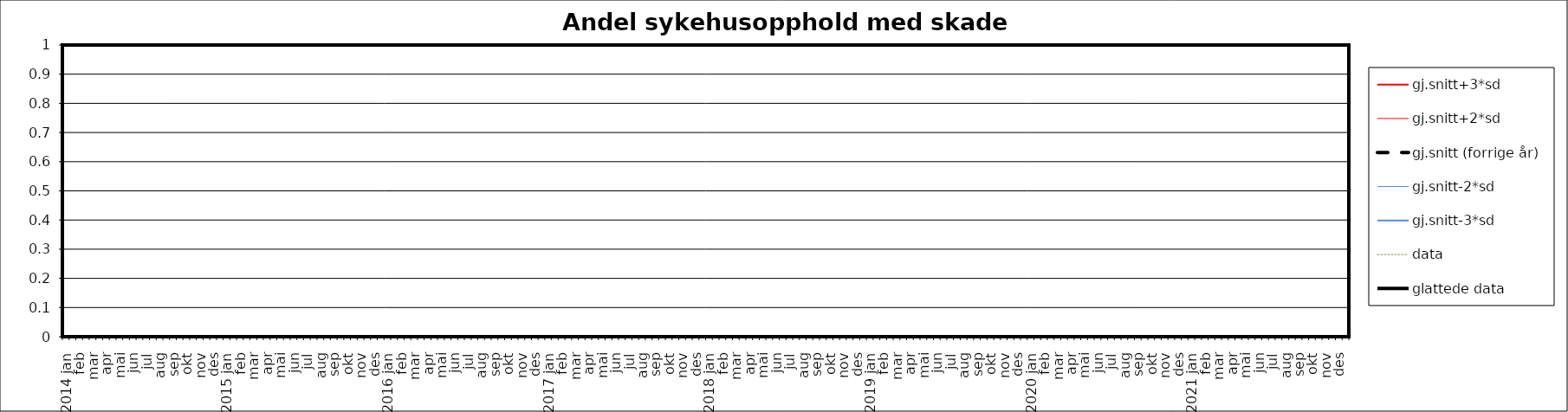
| Category | gj.snitt+3*sd | gj.snitt+2*sd | gj.snitt (forrige år) | gj.snitt-2*sd | gj.snitt-3*sd | data | glattede data |
|---|---|---|---|---|---|---|---|
| 2014 jan | 0 | 0 | 0 | 0 | 0 | 0 | 0 |
|  | 0 | 0 | 0 | 0 | 0 | 0 | 0 |
| feb | 0 | 0 | 0 | 0 | 0 | 0 | 0 |
|  | 0 | 0 | 0 | 0 | 0 | 0 | 0 |
| mar | 0 | 0 | 0 | 0 | 0 | 0 | 0 |
|  | 0 | 0 | 0 | 0 | 0 | 0 | 0 |
| apr | 0 | 0 | 0 | 0 | 0 | 0 | 0 |
|  | 0 | 0 | 0 | 0 | 0 | 0 | 0 |
| mai | 0 | 0 | 0 | 0 | 0 | 0 | 0 |
|  | 0 | 0 | 0 | 0 | 0 | 0 | 0 |
| jun | 0 | 0 | 0 | 0 | 0 | 0 | 0 |
|  | 0 | 0 | 0 | 0 | 0 | 0 | 0 |
| jul | 0 | 0 | 0 | 0 | 0 | 0 | 0 |
|  | 0 | 0 | 0 | 0 | 0 | 0 | 0 |
| aug | 0 | 0 | 0 | 0 | 0 | 0 | 0 |
|  | 0 | 0 | 0 | 0 | 0 | 0 | 0 |
| sep | 0 | 0 | 0 | 0 | 0 | 0 | 0 |
|  | 0 | 0 | 0 | 0 | 0 | 0 | 0 |
| okt | 0 | 0 | 0 | 0 | 0 | 0 | 0 |
|  | 0 | 0 | 0 | 0 | 0 | 0 | 0 |
| nov | 0 | 0 | 0 | 0 | 0 | 0 | 0 |
|  | 0 | 0 | 0 | 0 | 0 | 0 | 0 |
| des | 0 | 0 | 0 | 0 | 0 | 0 | 0 |
|  | 0 | 0 | 0 | 0 | 0 | 0 | 0 |
| 2015 jan | 0 | 0 | 0 | 0 | 0 | 0 | 0 |
|  | 0 | 0 | 0 | 0 | 0 | 0 | 0 |
| feb | 0 | 0 | 0 | 0 | 0 | 0 | 0 |
|  | 0 | 0 | 0 | 0 | 0 | 0 | 0 |
| mar | 0 | 0 | 0 | 0 | 0 | 0 | 0 |
|  | 0 | 0 | 0 | 0 | 0 | 0 | 0 |
| apr | 0 | 0 | 0 | 0 | 0 | 0 | 0 |
|  | 0 | 0 | 0 | 0 | 0 | 0 | 0 |
| mai | 0 | 0 | 0 | 0 | 0 | 0 | 0 |
|  | 0 | 0 | 0 | 0 | 0 | 0 | 0 |
| jun | 0 | 0 | 0 | 0 | 0 | 0 | 0 |
|  | 0 | 0 | 0 | 0 | 0 | 0 | 0 |
| jul | 0 | 0 | 0 | 0 | 0 | 0 | 0 |
|  | 0 | 0 | 0 | 0 | 0 | 0 | 0 |
| aug | 0 | 0 | 0 | 0 | 0 | 0 | 0 |
|  | 0 | 0 | 0 | 0 | 0 | 0 | 0 |
| sep | 0 | 0 | 0 | 0 | 0 | 0 | 0 |
|  | 0 | 0 | 0 | 0 | 0 | 0 | 0 |
| okt | 0 | 0 | 0 | 0 | 0 | 0 | 0 |
|  | 0 | 0 | 0 | 0 | 0 | 0 | 0 |
| nov | 0 | 0 | 0 | 0 | 0 | 0 | 0 |
|  | 0 | 0 | 0 | 0 | 0 | 0 | 0 |
| des | 0 | 0 | 0 | 0 | 0 | 0 | 0 |
|  | 0 | 0 | 0 | 0 | 0 | 0 | 0 |
| 2016 jan | 0 | 0 | 0 | 0 | 0 | 0 | 0 |
|  | 0 | 0 | 0 | 0 | 0 | 0 | 0 |
| feb | 0 | 0 | 0 | 0 | 0 | 0 | 0 |
|  | 0 | 0 | 0 | 0 | 0 | 0 | 0 |
| mar | 0 | 0 | 0 | 0 | 0 | 0 | 0 |
|  | 0 | 0 | 0 | 0 | 0 | 0 | 0 |
| apr | 0 | 0 | 0 | 0 | 0 | 0 | 0 |
|  | 0 | 0 | 0 | 0 | 0 | 0 | 0 |
| mai | 0 | 0 | 0 | 0 | 0 | 0 | 0 |
|  | 0 | 0 | 0 | 0 | 0 | 0 | 0 |
| jun | 0 | 0 | 0 | 0 | 0 | 0 | 0 |
|  | 0 | 0 | 0 | 0 | 0 | 0 | 0 |
| jul | 0 | 0 | 0 | 0 | 0 | 0 | 0 |
|  | 0 | 0 | 0 | 0 | 0 | 0 | 0 |
| aug | 0 | 0 | 0 | 0 | 0 | 0 | 0 |
|  | 0 | 0 | 0 | 0 | 0 | 0 | 0 |
| sep | 0 | 0 | 0 | 0 | 0 | 0 | 0 |
|  | 0 | 0 | 0 | 0 | 0 | 0 | 0 |
| okt | 0 | 0 | 0 | 0 | 0 | 0 | 0 |
|  | 0 | 0 | 0 | 0 | 0 | 0 | 0 |
| nov | 0 | 0 | 0 | 0 | 0 | 0 | 0 |
|  | 0 | 0 | 0 | 0 | 0 | 0 | 0 |
| des | 0 | 0 | 0 | 0 | 0 | 0 | 0 |
|  | 0 | 0 | 0 | 0 | 0 | 0 | 0 |
| 2017 jan | 0 | 0 | 0 | 0 | 0 | 0 | 0 |
|  | 0 | 0 | 0 | 0 | 0 | 0 | 0 |
| feb | 0 | 0 | 0 | 0 | 0 | 0 | 0 |
|  | 0 | 0 | 0 | 0 | 0 | 0 | 0 |
| mar | 0 | 0 | 0 | 0 | 0 | 0 | 0 |
|  | 0 | 0 | 0 | 0 | 0 | 0 | 0 |
| apr | 0 | 0 | 0 | 0 | 0 | 0 | 0 |
|  | 0 | 0 | 0 | 0 | 0 | 0 | 0 |
| mai | 0 | 0 | 0 | 0 | 0 | 0 | 0 |
|  | 0 | 0 | 0 | 0 | 0 | 0 | 0 |
| jun | 0 | 0 | 0 | 0 | 0 | 0 | 0 |
|  | 0 | 0 | 0 | 0 | 0 | 0 | 0 |
| jul | 0 | 0 | 0 | 0 | 0 | 0 | 0 |
|  | 0 | 0 | 0 | 0 | 0 | 0 | 0 |
| aug | 0 | 0 | 0 | 0 | 0 | 0 | 0 |
|  | 0 | 0 | 0 | 0 | 0 | 0 | 0 |
| sep | 0 | 0 | 0 | 0 | 0 | 0 | 0 |
|  | 0 | 0 | 0 | 0 | 0 | 0 | 0 |
| okt | 0 | 0 | 0 | 0 | 0 | 0 | 0 |
|  | 0 | 0 | 0 | 0 | 0 | 0 | 0 |
| nov | 0 | 0 | 0 | 0 | 0 | 0 | 0 |
|  | 0 | 0 | 0 | 0 | 0 | 0 | 0 |
| des | 0 | 0 | 0 | 0 | 0 | 0 | 0 |
|  | 0 | 0 | 0 | 0 | 0 | 0 | 0 |
| 2018 jan | 0 | 0 | 0 | 0 | 0 | 0 | 0 |
|  | 0 | 0 | 0 | 0 | 0 | 0 | 0 |
| feb | 0 | 0 | 0 | 0 | 0 | 0 | 0 |
|  | 0 | 0 | 0 | 0 | 0 | 0 | 0 |
| mar | 0 | 0 | 0 | 0 | 0 | 0 | 0 |
|  | 0 | 0 | 0 | 0 | 0 | 0 | 0 |
| apr | 0 | 0 | 0 | 0 | 0 | 0 | 0 |
|  | 0 | 0 | 0 | 0 | 0 | 0 | 0 |
| mai | 0 | 0 | 0 | 0 | 0 | 0 | 0 |
|  | 0 | 0 | 0 | 0 | 0 | 0 | 0 |
| jun | 0 | 0 | 0 | 0 | 0 | 0 | 0 |
|  | 0 | 0 | 0 | 0 | 0 | 0 | 0 |
| jul | 0 | 0 | 0 | 0 | 0 | 0 | 0 |
|  | 0 | 0 | 0 | 0 | 0 | 0 | 0 |
| aug | 0 | 0 | 0 | 0 | 0 | 0 | 0 |
|  | 0 | 0 | 0 | 0 | 0 | 0 | 0 |
| sep | 0 | 0 | 0 | 0 | 0 | 0 | 0 |
|  | 0 | 0 | 0 | 0 | 0 | 0 | 0 |
| okt | 0 | 0 | 0 | 0 | 0 | 0 | 0 |
|  | 0 | 0 | 0 | 0 | 0 | 0 | 0 |
| nov | 0 | 0 | 0 | 0 | 0 | 0 | 0 |
|  | 0 | 0 | 0 | 0 | 0 | 0 | 0 |
| des | 0 | 0 | 0 | 0 | 0 | 0 | 0 |
|  | 0 | 0 | 0 | 0 | 0 | 0 | 0 |
| 2019 jan | 0 | 0 | 0 | 0 | 0 | 0 | 0 |
|  | 0 | 0 | 0 | 0 | 0 | 0 | 0 |
| feb | 0 | 0 | 0 | 0 | 0 | 0 | 0 |
|  | 0 | 0 | 0 | 0 | 0 | 0 | 0 |
| mar | 0 | 0 | 0 | 0 | 0 | 0 | 0 |
|  | 0 | 0 | 0 | 0 | 0 | 0 | 0 |
| apr | 0 | 0 | 0 | 0 | 0 | 0 | 0 |
|  | 0 | 0 | 0 | 0 | 0 | 0 | 0 |
| mai | 0 | 0 | 0 | 0 | 0 | 0 | 0 |
|  | 0 | 0 | 0 | 0 | 0 | 0 | 0 |
| jun | 0 | 0 | 0 | 0 | 0 | 0 | 0 |
|  | 0 | 0 | 0 | 0 | 0 | 0 | 0 |
| jul | 0 | 0 | 0 | 0 | 0 | 0 | 0 |
|  | 0 | 0 | 0 | 0 | 0 | 0 | 0 |
| aug | 0 | 0 | 0 | 0 | 0 | 0 | 0 |
|  | 0 | 0 | 0 | 0 | 0 | 0 | 0 |
| sep | 0 | 0 | 0 | 0 | 0 | 0 | 0 |
|  | 0 | 0 | 0 | 0 | 0 | 0 | 0 |
| okt | 0 | 0 | 0 | 0 | 0 | 0 | 0 |
|  | 0 | 0 | 0 | 0 | 0 | 0 | 0 |
| nov | 0 | 0 | 0 | 0 | 0 | 0 | 0 |
|  | 0 | 0 | 0 | 0 | 0 | 0 | 0 |
| des | 0 | 0 | 0 | 0 | 0 | 0 | 0 |
|  | 0 | 0 | 0 | 0 | 0 | 0 | 0 |
| 2020 jan | 0 | 0 | 0 | 0 | 0 | 0 | 0 |
|  | 0 | 0 | 0 | 0 | 0 | 0 | 0 |
| feb | 0 | 0 | 0 | 0 | 0 | 0 | 0 |
|  | 0 | 0 | 0 | 0 | 0 | 0 | 0 |
| mar | 0 | 0 | 0 | 0 | 0 | 0 | 0 |
|  | 0 | 0 | 0 | 0 | 0 | 0 | 0 |
| apr | 0 | 0 | 0 | 0 | 0 | 0 | 0 |
|  | 0 | 0 | 0 | 0 | 0 | 0 | 0 |
| mai | 0 | 0 | 0 | 0 | 0 | 0 | 0 |
|  | 0 | 0 | 0 | 0 | 0 | 0 | 0 |
| jun | 0 | 0 | 0 | 0 | 0 | 0 | 0 |
|  | 0 | 0 | 0 | 0 | 0 | 0 | 0 |
| jul | 0 | 0 | 0 | 0 | 0 | 0 | 0 |
|  | 0 | 0 | 0 | 0 | 0 | 0 | 0 |
| aug | 0 | 0 | 0 | 0 | 0 | 0 | 0 |
|  | 0 | 0 | 0 | 0 | 0 | 0 | 0 |
| sep | 0 | 0 | 0 | 0 | 0 | 0 | 0 |
|  | 0 | 0 | 0 | 0 | 0 | 0 | 0 |
| okt | 0 | 0 | 0 | 0 | 0 | 0 | 0 |
|  | 0 | 0 | 0 | 0 | 0 | 0 | 0 |
| nov | 0 | 0 | 0 | 0 | 0 | 0 | 0 |
|  | 0 | 0 | 0 | 0 | 0 | 0 | 0 |
| des | 0 | 0 | 0 | 0 | 0 | 0 | 0 |
|  | 0 | 0 | 0 | 0 | 0 | 0 | 0 |
| 2021 jan | 0 | 0 | 0 | 0 | 0 | 0 | 0 |
|  | 0 | 0 | 0 | 0 | 0 | 0 | 0 |
| feb | 0 | 0 | 0 | 0 | 0 | 0 | 0 |
|  | 0 | 0 | 0 | 0 | 0 | 0 | 0 |
| mar | 0 | 0 | 0 | 0 | 0 | 0 | 0 |
|  | 0 | 0 | 0 | 0 | 0 | 0 | 0 |
| apr | 0 | 0 | 0 | 0 | 0 | 0 | 0 |
|  | 0 | 0 | 0 | 0 | 0 | 0 | 0 |
| mai | 0 | 0 | 0 | 0 | 0 | 0 | 0 |
|  | 0 | 0 | 0 | 0 | 0 | 0 | 0 |
| jun | 0 | 0 | 0 | 0 | 0 | 0 | 0 |
|  | 0 | 0 | 0 | 0 | 0 | 0 | 0 |
| jul | 0 | 0 | 0 | 0 | 0 | 0 | 0 |
|  | 0 | 0 | 0 | 0 | 0 | 0 | 0 |
| aug | 0 | 0 | 0 | 0 | 0 | 0 | 0 |
|  | 0 | 0 | 0 | 0 | 0 | 0 | 0 |
| sep | 0 | 0 | 0 | 0 | 0 | 0 | 0 |
|  | 0 | 0 | 0 | 0 | 0 | 0 | 0 |
| okt | 0 | 0 | 0 | 0 | 0 | 0 | 0 |
|  | 0 | 0 | 0 | 0 | 0 | 0 | 0 |
| nov | 0 | 0 | 0 | 0 | 0 | 0 | 0 |
|  | 0 | 0 | 0 | 0 | 0 | 0 | 0 |
| des | 0 | 0 | 0 | 0 | 0 | 0 | 0 |